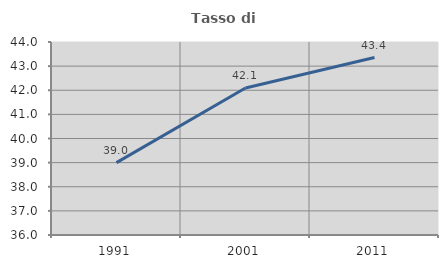
| Category | Tasso di occupazione   |
|---|---|
| 1991.0 | 38.999 |
| 2001.0 | 42.09 |
| 2011.0 | 43.355 |